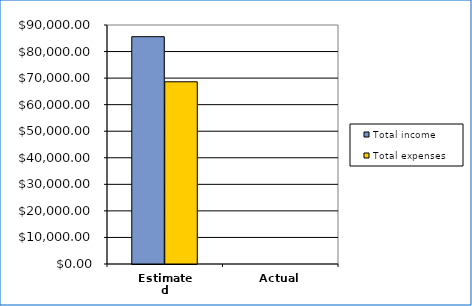
| Category | Total income | Total expenses |
|---|---|---|
| Estimated | 85602 | 68615.25 |
| Actual | 0 | 0 |